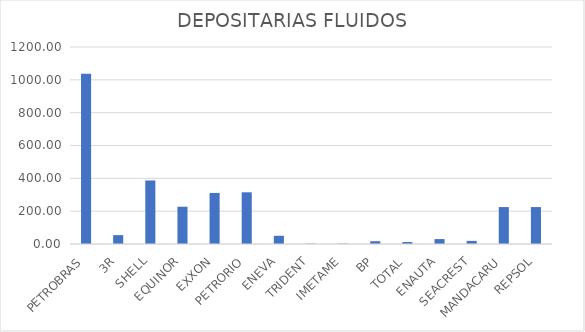
| Category | Series 0 |
|---|---|
| PETROBRAS | 1037 |
| 3R | 54 |
| SHELL | 387 |
| EQUINOR | 227 |
| EXXON | 311 |
| PETRORIO | 315 |
| ENEVA | 50 |
| TRIDENT | 2 |
| IMETAME | 2 |
| BP | 17 |
| TOTAL | 12 |
| ENAUTA | 30 |
| SEACREST | 19 |
| MANDACARU | 225 |
| REPSOL | 225 |